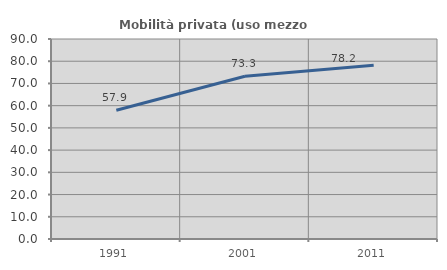
| Category | Mobilità privata (uso mezzo privato) |
|---|---|
| 1991.0 | 57.91 |
| 2001.0 | 73.261 |
| 2011.0 | 78.152 |